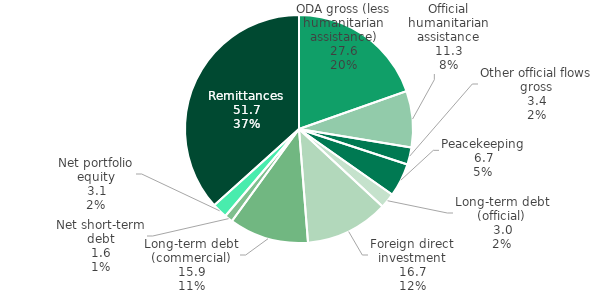
| Category | Series 0 |
|---|---|
| ODA gross (less humanitarian assistance) | 27.647 |
| Official humanitarian assistance | 11.267 |
| Other official flows gross | 3.421 |
| Peacekeeping | 6.671 |
| Long-term debt (official) | 3.016 |
| Foreign direct investment | 16.685 |
| Long-term debt (commercial) | 15.897 |
| Net short-term debt | 1.637 |
| Net portfolio equity | 3.057 |
| Remittances | 51.669 |